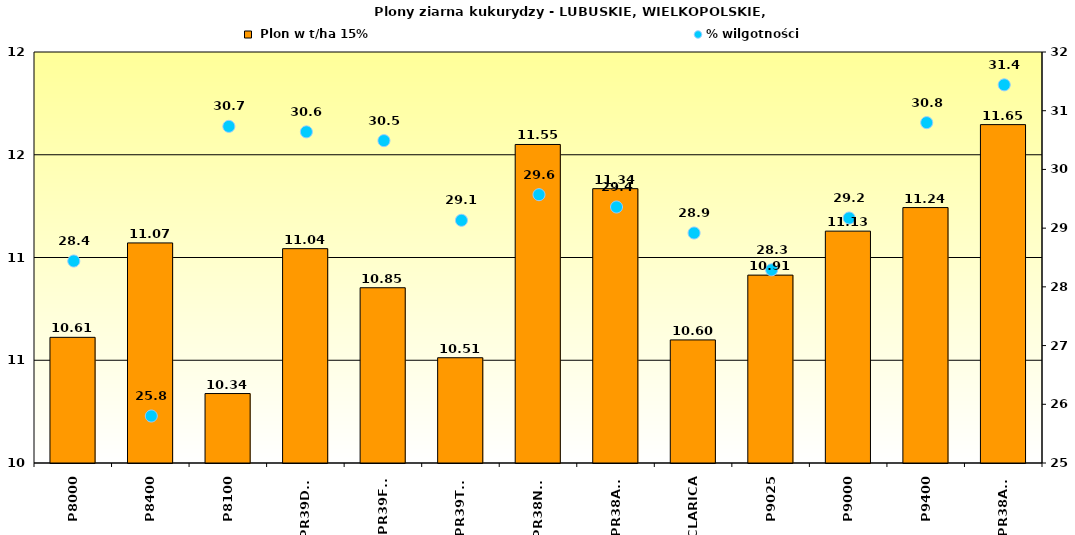
| Category |  Plon w t/ha 15% |
|---|---|
| P8000 | 10.611 |
| P8400 | 11.071 |
| P8100 | 10.338 |
| PR39D23 | 11.043 |
| PR39F58 | 10.853 |
| PR39T83 | 10.512 |
| PR38N86 | 11.55 |
| PR38A79 | 11.335 |
| CLARICA | 10.599 |
| P9025 | 10.914 |
| P9000 | 11.128 |
| P9400 | 11.243 |
| PR38A24 | 11.647 |